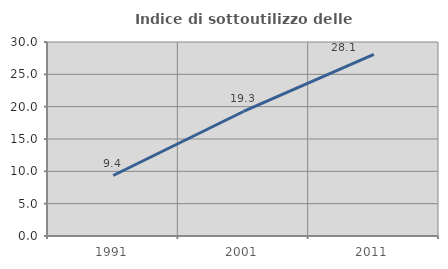
| Category | Indice di sottoutilizzo delle abitazioni  |
|---|---|
| 1991.0 | 9.353 |
| 2001.0 | 19.255 |
| 2011.0 | 28.07 |